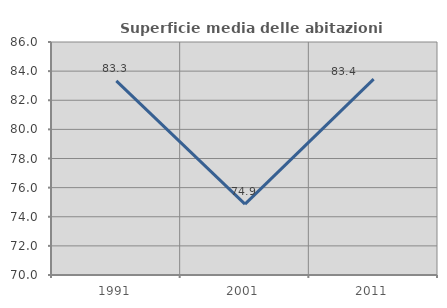
| Category | Superficie media delle abitazioni occupate |
|---|---|
| 1991.0 | 83.334 |
| 2001.0 | 74.869 |
| 2011.0 | 83.45 |